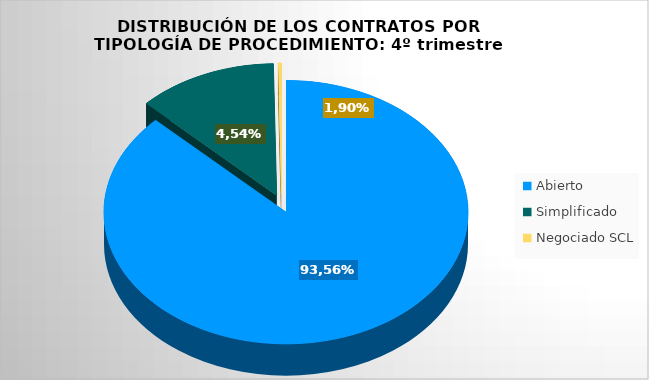
| Category | Importe adjudicado | Porcentaje |
|---|---|---|
| Abierto  | 1588914.841 | 0.873 |
| Simplificado | 226295.16 | 0.124 |
| Negociado SCL | 5270 | 0.003 |